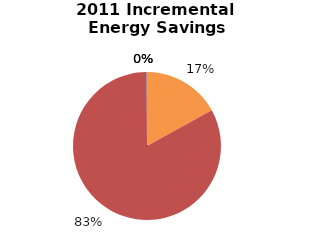
| Category | Incremental Energy Savings (kWh) |
|---|---|
| Consumer Program Total | 81711.958 |
| Business Program Total | 399653.24 |
| Industrial Program Total | 0 |
| Home Assistance Program Total | 0 |
| Pre-2011 Programs completed in 2011 Total | 340.223 |